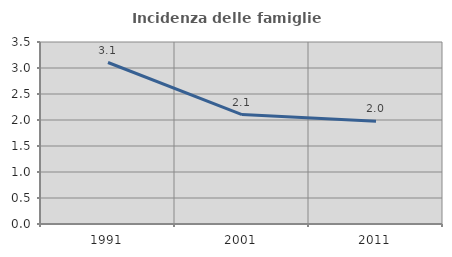
| Category | Incidenza delle famiglie numerose |
|---|---|
| 1991.0 | 3.105 |
| 2001.0 | 2.104 |
| 2011.0 | 1.974 |